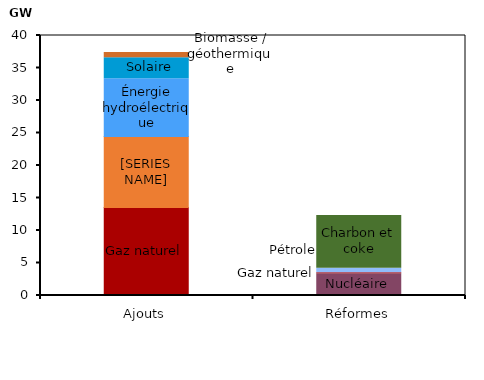
| Category | Nucléaire | Gaz naturel | Pétrole | Éolien | Énergie hydroélectrique | Solaire | Biomasse / géothermique | Charbon et coke |
|---|---|---|---|---|---|---|---|---|
| Ajouts | 0 | 13.529 | 0 | 10.923 | 8.903 | 3.216 | 0.806 | 0 |
| Réformes | 3.36 | 0.15 | 0.667 | 0 | 0 | 0 | 0 | 8.126 |